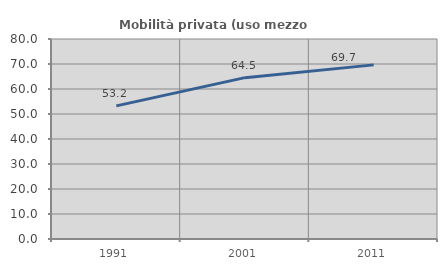
| Category | Mobilità privata (uso mezzo privato) |
|---|---|
| 1991.0 | 53.241 |
| 2001.0 | 64.545 |
| 2011.0 | 69.652 |